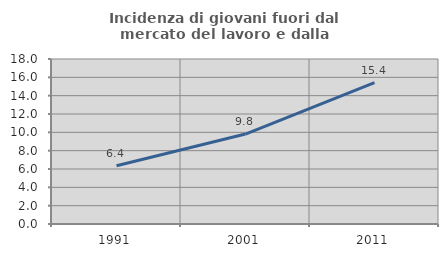
| Category | Incidenza di giovani fuori dal mercato del lavoro e dalla formazione  |
|---|---|
| 1991.0 | 6.363 |
| 2001.0 | 9.812 |
| 2011.0 | 15.431 |